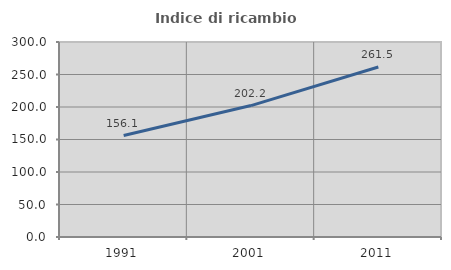
| Category | Indice di ricambio occupazionale  |
|---|---|
| 1991.0 | 156.119 |
| 2001.0 | 202.204 |
| 2011.0 | 261.463 |